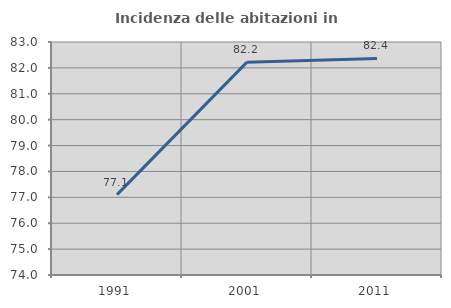
| Category | Incidenza delle abitazioni in proprietà  |
|---|---|
| 1991.0 | 77.104 |
| 2001.0 | 82.222 |
| 2011.0 | 82.365 |